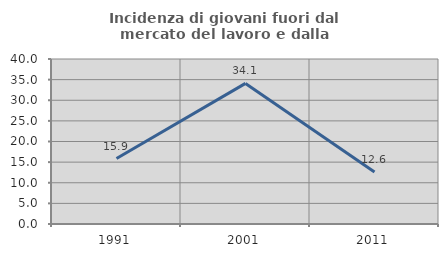
| Category | Incidenza di giovani fuori dal mercato del lavoro e dalla formazione  |
|---|---|
| 1991.0 | 15.867 |
| 2001.0 | 34.087 |
| 2011.0 | 12.589 |